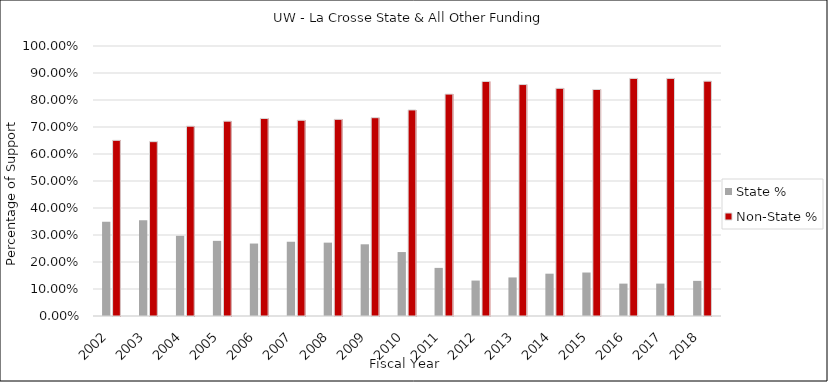
| Category | State % | Non-State % |
|---|---|---|
| 2002.0 | 0.349 | 0.651 |
| 2003.0 | 0.354 | 0.646 |
| 2004.0 | 0.297 | 0.703 |
| 2005.0 | 0.278 | 0.722 |
| 2006.0 | 0.268 | 0.732 |
| 2007.0 | 0.275 | 0.725 |
| 2008.0 | 0.272 | 0.728 |
| 2009.0 | 0.266 | 0.734 |
| 2010.0 | 0.237 | 0.763 |
| 2011.0 | 0.178 | 0.822 |
| 2012.0 | 0.131 | 0.869 |
| 2013.0 | 0.143 | 0.857 |
| 2014.0 | 0.157 | 0.843 |
| 2015.0 | 0.161 | 0.839 |
| 2016.0 | 0.12 | 0.88 |
| 2017.0 | 0.12 | 0.88 |
| 2018.0 | 0.13 | 0.87 |